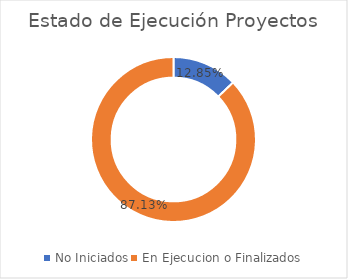
| Category | Series 0 |
|---|---|
| No Iniciados | 0.128 |
| En Ejecucion o Finalizados | 0.871 |